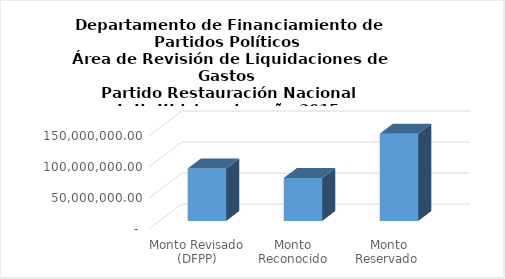
| Category | Series 0 |
|---|---|
| Monto Revisado (DFPP) | 84575304.56 |
| Monto Reconocido (TSE) | 69373338 |
| Monto Reservado  | 140391411.386 |